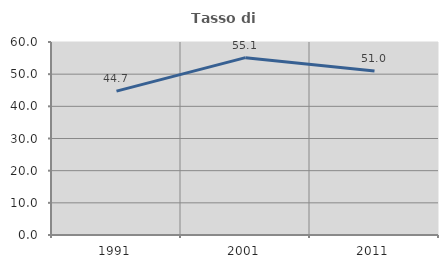
| Category | Tasso di occupazione   |
|---|---|
| 1991.0 | 44.722 |
| 2001.0 | 55.138 |
| 2011.0 | 50.953 |